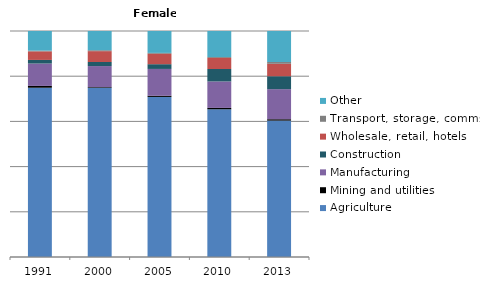
| Category | Agriculture | Mining and utilities | Manufacturing | Construction | Wholesale, retail, hotels | Transport, storage, comms | Other |
|---|---|---|---|---|---|---|---|
| 1991.0 | 74.9 | 0.8 | 9.9 | 1.6 | 3.8 | 0.3 | 8.7 |
| 2000.0 | 74.8 | 0.3 | 9.3 | 1.8 | 4.8 | 0.4 | 8.5 |
| 2005.0 | 70.9 | 0.5 | 11.9 | 2.1 | 4.6 | 0.4 | 9.7 |
| 2010.0 | 65.3 | 0.6 | 11.7 | 5.5 | 4.9 | 0.4 | 11.5 |
| 2013.0 | 60.3 | 0.6 | 13.3 | 5.7 | 5.5 | 0.8 | 13.7 |